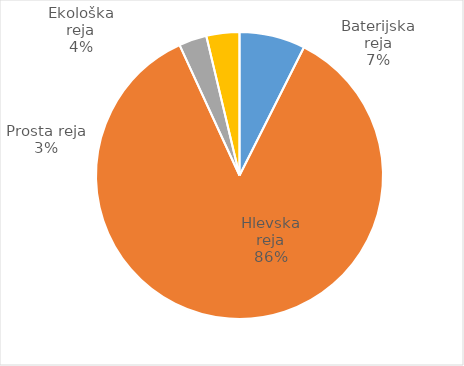
| Category | Število kosov jajc |
|---|---|
| Baterijska reja | 271351 |
| Hlevska reja | 3136893 |
| Prosta reja | 114855 |
| Ekološka reja | 136008 |